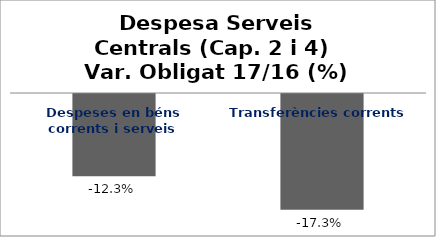
| Category | Series 0 |
|---|---|
| Despeses en béns corrents i serveis | -0.123 |
| Transferències corrents | -0.173 |